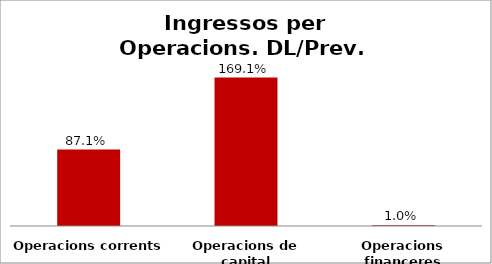
| Category | Series 0 |
|---|---|
| Operacions corrents | 0.871 |
| Operacions de capital | 1.691 |
| Operacions financeres | 0.01 |